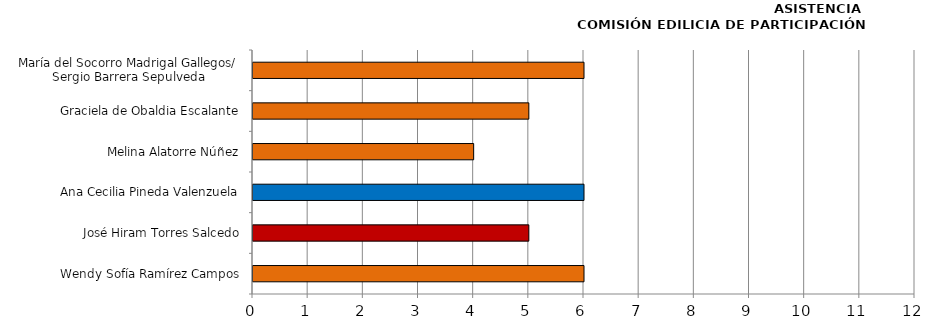
| Category | Series 0 |
|---|---|
| Wendy Sofía Ramírez Campos | 6 |
| José Hiram Torres Salcedo | 5 |
| Ana Cecilia Pineda Valenzuela | 6 |
| Melina Alatorre Núñez | 4 |
| Graciela de Obaldia Escalante | 5 |
| María del Socorro Madrigal Gallegos/
Sergio Barrera Sepulveda | 6 |